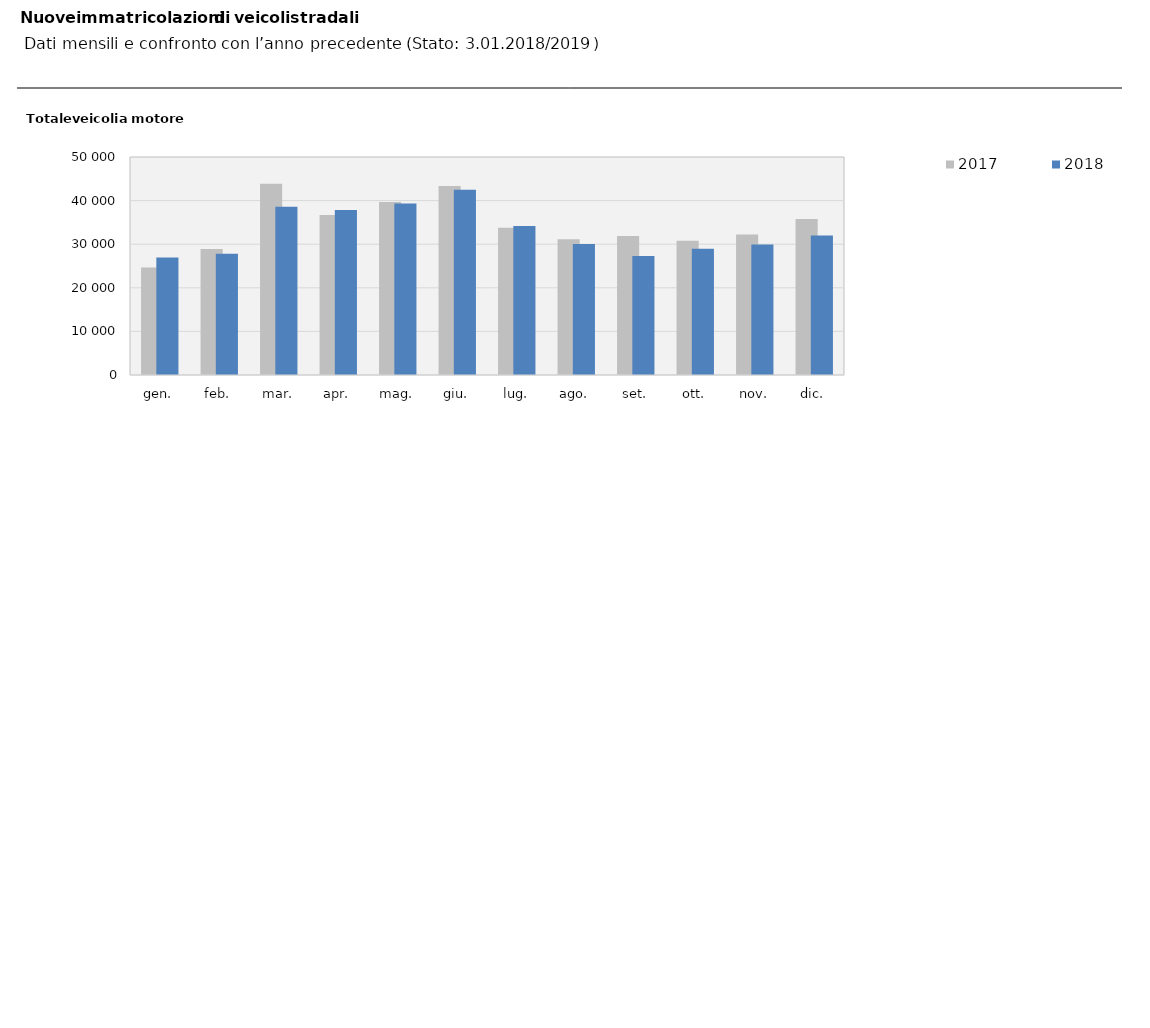
| Category | 2017 | 2018 |
|---|---|---|
| gen. | 24684 | 26923 |
| feb. | 28910 | 27829 |
| mar. | 43850 | 38587 |
| apr. | 36715 | 37846 |
| mag. | 39663 | 39349 |
| giu. | 43373 | 42480 |
| lug. | 33772 | 34171 |
| ago. | 31139 | 30026 |
| set. | 31894 | 27310 |
| ott. | 30790 | 28966 |
| nov. | 32246 | 29910 |
| dic. | 35791 | 32016 |